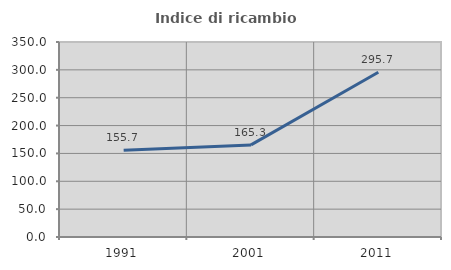
| Category | Indice di ricambio occupazionale  |
|---|---|
| 1991.0 | 155.714 |
| 2001.0 | 165.278 |
| 2011.0 | 295.652 |